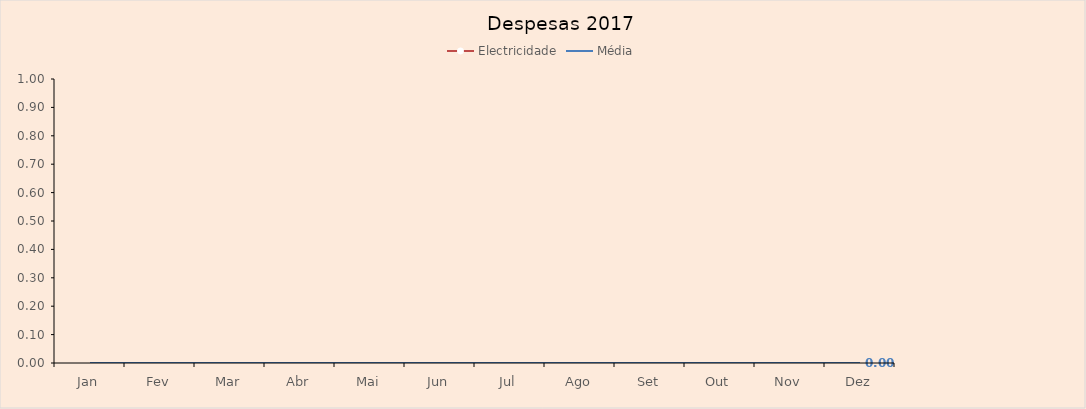
| Category | Electricidade | Média |
|---|---|---|
| Jan |  | 0 |
| Fev |  | 0 |
| Mar |  | 0 |
| Abr |  | 0 |
| Mai |  | 0 |
| Jun |  | 0 |
| Jul |  | 0 |
| Ago |  | 0 |
| Set |  | 0 |
| Out |  | 0 |
| Nov |  | 0 |
| Dez |  | 0 |